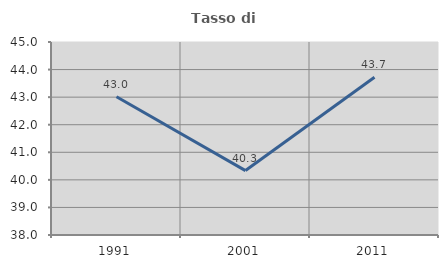
| Category | Tasso di occupazione   |
|---|---|
| 1991.0 | 43.013 |
| 2001.0 | 40.336 |
| 2011.0 | 43.72 |